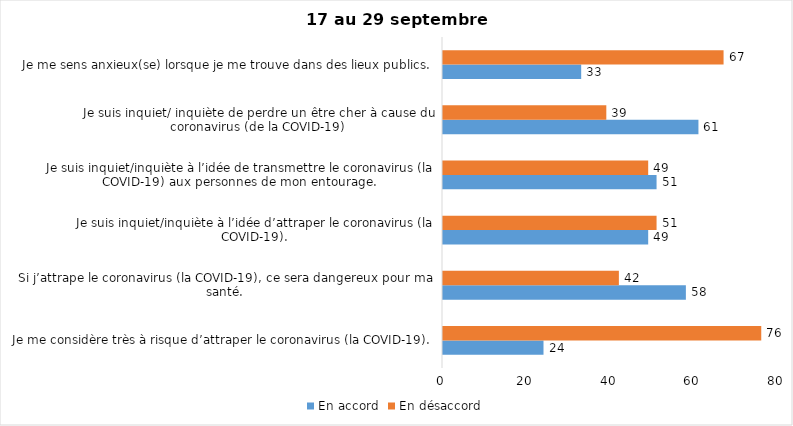
| Category | En accord | En désaccord |
|---|---|---|
| Je me considère très à risque d’attraper le coronavirus (la COVID-19). | 24 | 76 |
| Si j’attrape le coronavirus (la COVID-19), ce sera dangereux pour ma santé. | 58 | 42 |
| Je suis inquiet/inquiète à l’idée d’attraper le coronavirus (la COVID-19). | 49 | 51 |
| Je suis inquiet/inquiète à l’idée de transmettre le coronavirus (la COVID-19) aux personnes de mon entourage. | 51 | 49 |
| Je suis inquiet/ inquiète de perdre un être cher à cause du coronavirus (de la COVID-19) | 61 | 39 |
| Je me sens anxieux(se) lorsque je me trouve dans des lieux publics. | 33 | 67 |